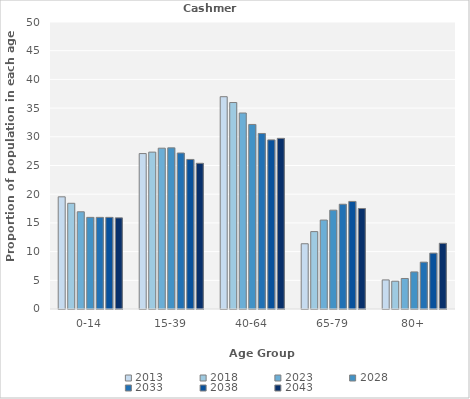
| Category | 2013 | 2018 | 2023 | 2028 | 2033 | 2038 | 2043 |
|---|---|---|---|---|---|---|---|
| 0-14 | 19.543 | 18.416 | 16.937 | 15.964 | 15.964 | 15.964 | 15.882 |
| 15-39 | 27.078 | 27.33 | 28.018 | 28.072 | 27.175 | 26.054 | 25.385 |
| 40-64 | 36.986 | 35.973 | 34.144 | 32.152 | 30.583 | 29.462 | 29.729 |
| 65-79 | 11.37 | 13.484 | 15.495 | 17.22 | 18.251 | 18.744 | 17.511 |
| 80+ | 5.068 | 4.842 | 5.315 | 6.457 | 8.161 | 9.731 | 11.448 |